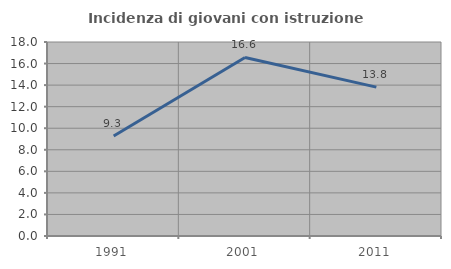
| Category | Incidenza di giovani con istruzione universitaria |
|---|---|
| 1991.0 | 9.272 |
| 2001.0 | 16.568 |
| 2011.0 | 13.812 |